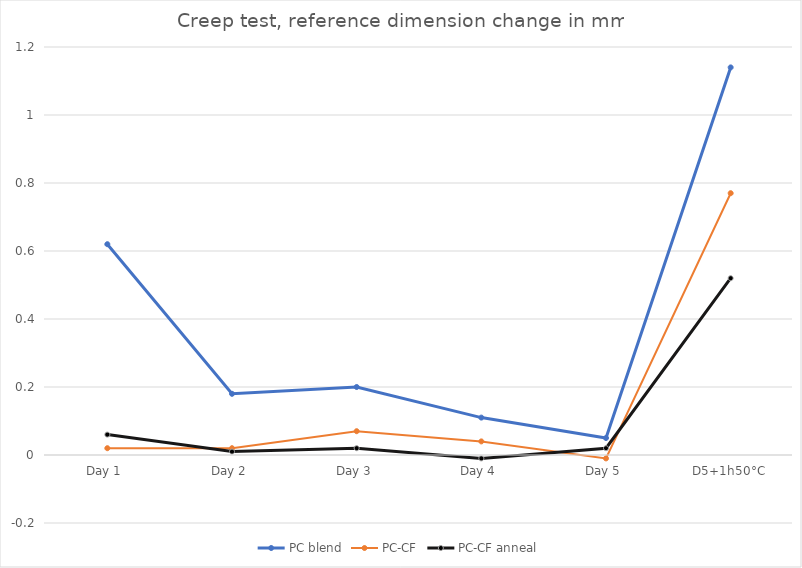
| Category | PC blend | PC-CF | PC-CF anneal |
|---|---|---|---|
| Day 1 | 0.62 | 0.02 | 0.06 |
| Day 2 | 0.18 | 0.02 | 0.01 |
| Day 3 | 0.2 | 0.07 | 0.02 |
| Day 4 | 0.11 | 0.04 | -0.01 |
| Day 5 | 0.05 | -0.01 | 0.02 |
| D5+1h50°C | 1.14 | 0.77 | 0.52 |